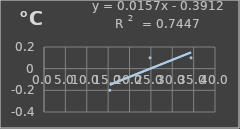
| Category | Temperatura |
|---|---|
| 15.4 | -0.2 |
| 24.8 | 0.1 |
| 34.4 | 0.1 |